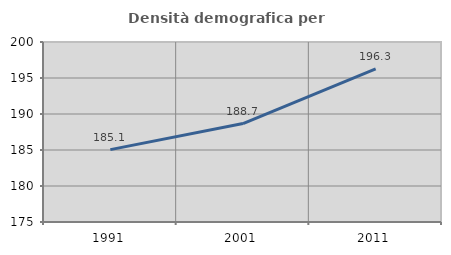
| Category | Densità demografica |
|---|---|
| 1991.0 | 185.051 |
| 2001.0 | 188.668 |
| 2011.0 | 196.252 |